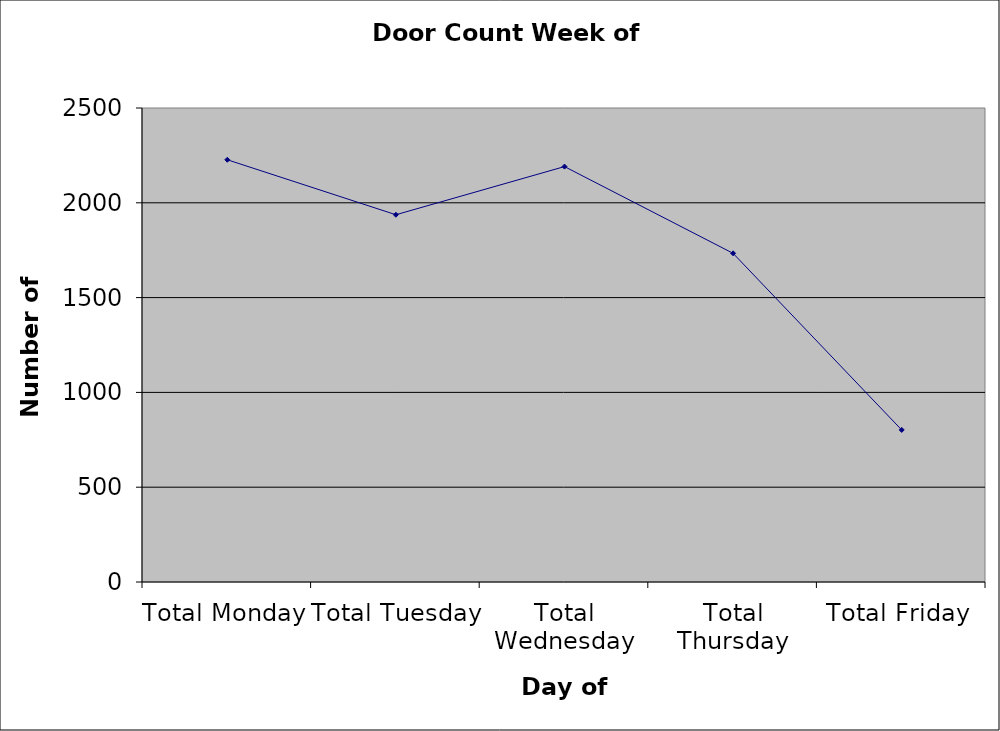
| Category | Series 0 |
|---|---|
| Total Monday | 2227 |
| Total Tuesday | 1937 |
| Total Wednesday | 2191 |
| Total Thursday | 1733.5 |
| Total Friday | 802 |